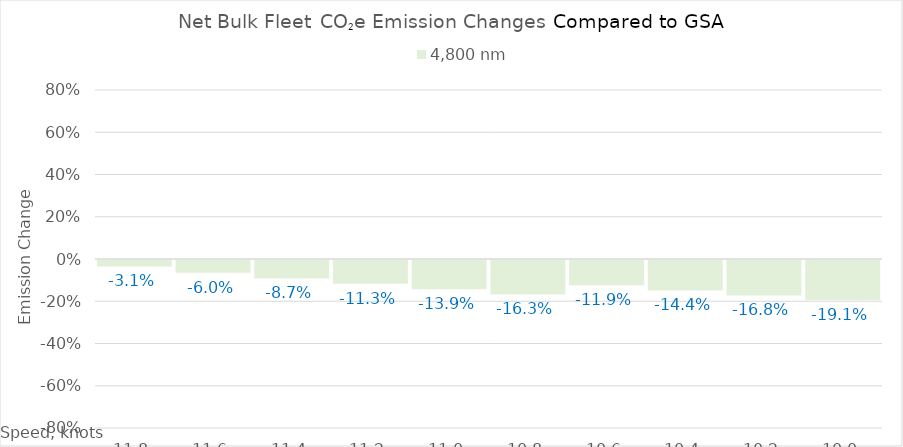
| Category | 4,800 |
|---|---|
| 11.8 | -0.031 |
| 11.600000000000001 | -0.06 |
| 11.400000000000002 | -0.087 |
| 11.200000000000003 | -0.113 |
| 11.000000000000004 | -0.139 |
| 10.800000000000004 | -0.163 |
| 10.600000000000005 | -0.119 |
| 10.400000000000006 | -0.144 |
| 10.200000000000006 | -0.168 |
| 10.000000000000007 | -0.191 |